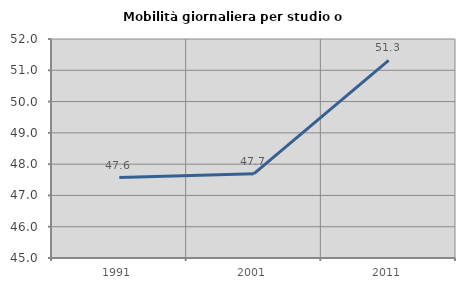
| Category | Mobilità giornaliera per studio o lavoro |
|---|---|
| 1991.0 | 47.573 |
| 2001.0 | 47.694 |
| 2011.0 | 51.317 |